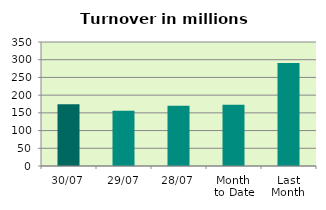
| Category | Series 0 |
|---|---|
| 30/07 | 173.997 |
| 29/07 | 155.832 |
| 28/07 | 169.998 |
| Month 
to Date | 173.123 |
| Last
Month | 290.981 |